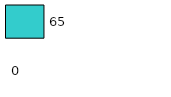
| Category | Series 0 | Series 1 |
|---|---|---|
| 0 | 0 | 65 |